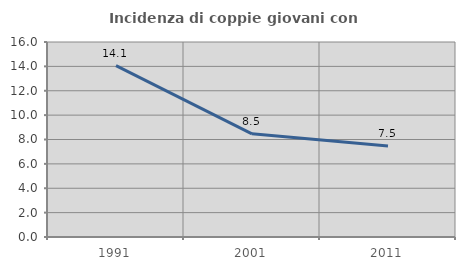
| Category | Incidenza di coppie giovani con figli |
|---|---|
| 1991.0 | 14.062 |
| 2001.0 | 8.467 |
| 2011.0 | 7.469 |